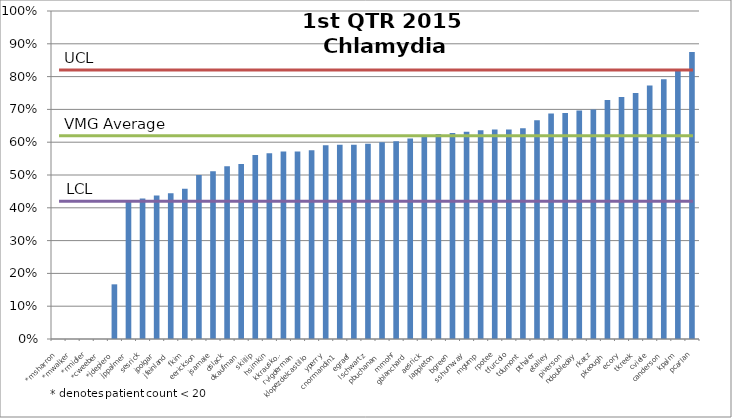
| Category | Series 0 |
|---|---|
| *msharron | 0 |
| *mwalker | 0 |
| *rmidler | 0 |
| *cweeber | 0 |
| *jdepiero | 0.167 |
| jppalmer | 0.421 |
| sesrick | 0.429 |
| jpolgar | 0.438 |
| jfeinland | 0.444 |
| fkim | 0.458 |
| eerickson | 0.5 |
| jsamale | 0.511 |
| dslack | 0.526 |
| dkaufman | 0.533 |
| skillip | 0.561 |
| hsimkin | 0.567 |
| kkrauskopf | 0.571 |
| rvigderman | 0.571 |
| klopezdelcastillo | 0.576 |
| yperry | 0.591 |
| cnormandin1 | 0.593 |
| egraef | 0.593 |
| lschwartz | 0.595 |
| pbuchanan | 0.6 |
| mmohr | 0.603 |
| gblanchard | 0.611 |
| aesrick | 0.621 |
| lappleton | 0.625 |
| bgreen | 0.628 |
| sshumway | 0.632 |
| mgump | 0.636 |
| rpotee | 0.639 |
| tfurcolo | 0.639 |
| tdumont | 0.643 |
| pthaler | 0.667 |
| etalley | 0.688 |
| piverson | 0.689 |
| ndoubleday | 0.697 |
| rkatz | 0.699 |
| pkeough | 0.729 |
| ecory | 0.738 |
| tkreek | 0.75 |
| cviele | 0.773 |
| canderson | 0.792 |
| kpalm | 0.818 |
| pcarlan | 0.875 |